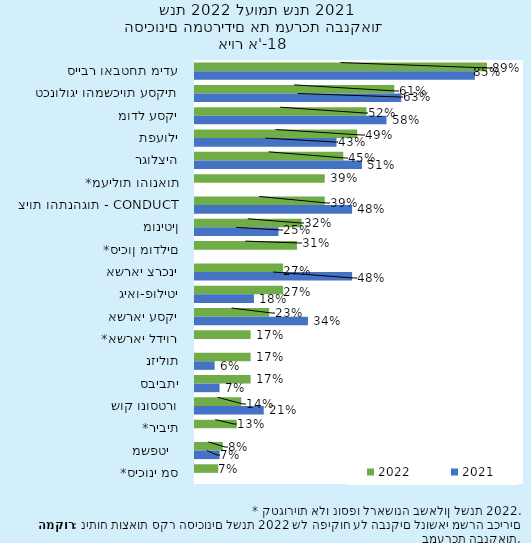
| Category | 2022 | 2021 |
|---|---|---|
| סייבר ואבטחת מידע | 0.887 | 0.851 |
| טכנולוגי והמשכיות עסקית | 0.606 | 0.627 |
| מודל עסקי | 0.521 | 0.582 |
| תפעולי | 0.493 | 0.43 |
| רגולציה | 0.451 | 0.507 |
| *מעילות והונאות | 0.394 | 0 |
| ציות והתנהגות - conduct | 0.394 | 0.478 |
| מוניטין | 0.324 | 0.254 |
| *סיכון מודלים | 0.31 | 0 |
| אשראי צרכני | 0.268 | 0.478 |
| גיאו-פוליטי | 0.268 | 0.179 |
| אשראי עסקי | 0.225 | 0.343 |
| *אשראי לדיור | 0.169 | 0 |
| נזילות | 0.169 | 0.06 |
| סביבתי | 0.169 | 0.075 |
| שוק ונוסטרו | 0.141 | 0.209 |
| *ריבית | 0.127 | 0 |
| משפטי   | 0.085 | 0.075 |
| *סיכוני מס | 0.07 | 0 |